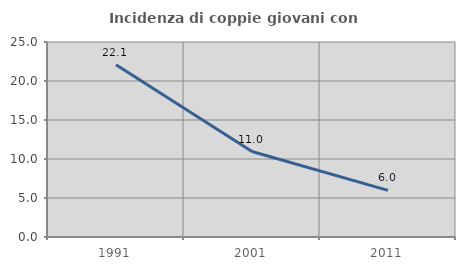
| Category | Incidenza di coppie giovani con figli |
|---|---|
| 1991.0 | 22.078 |
| 2001.0 | 10.959 |
| 2011.0 | 5.97 |